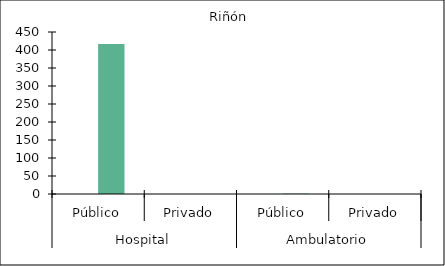
| Category |   |    Riñón |
|---|---|---|
| 0 | 0 | 417 |
| 1 | 0 | 0 |
| 2 | 0 | 1 |
| 3 | 0 | 0 |